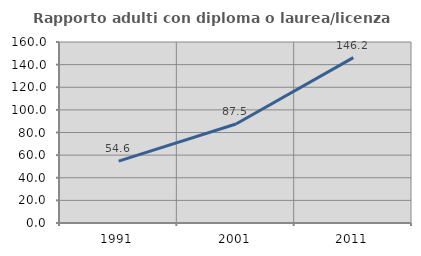
| Category | Rapporto adulti con diploma o laurea/licenza media  |
|---|---|
| 1991.0 | 54.639 |
| 2001.0 | 87.5 |
| 2011.0 | 146.154 |